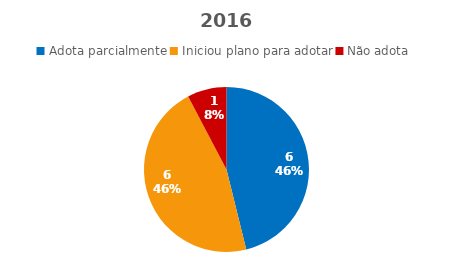
| Category | Total |
|---|---|
| Adota parcialmente | 6 |
| Iniciou plano para adotar | 6 |
| Não adota | 1 |